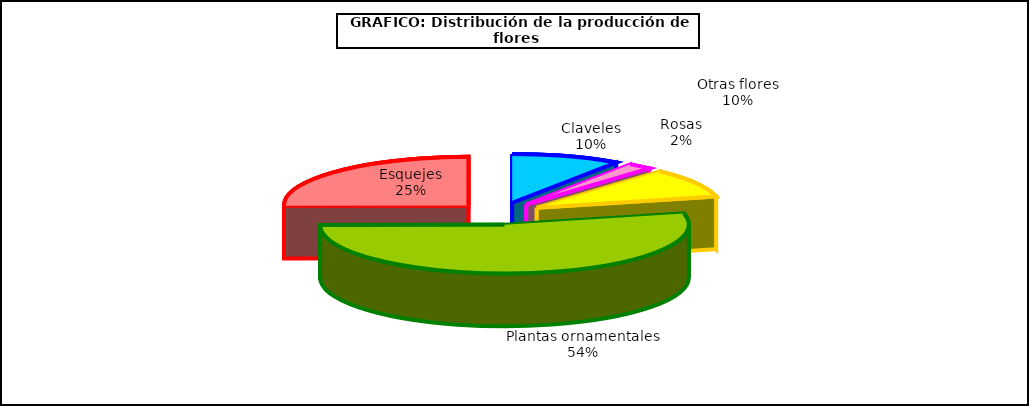
| Category | Series 0 |
|---|---|
| 0 | 47990 |
| 1 | 10480 |
| 2 | 48569 |
| 3 | 270020 |
| 4 | 126188 |